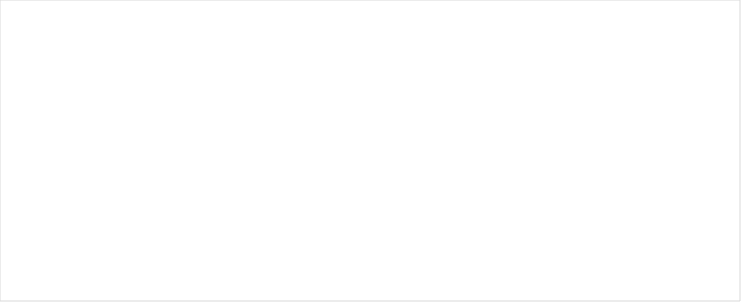
| Category | Total |
|---|---|
| Total | 0 |